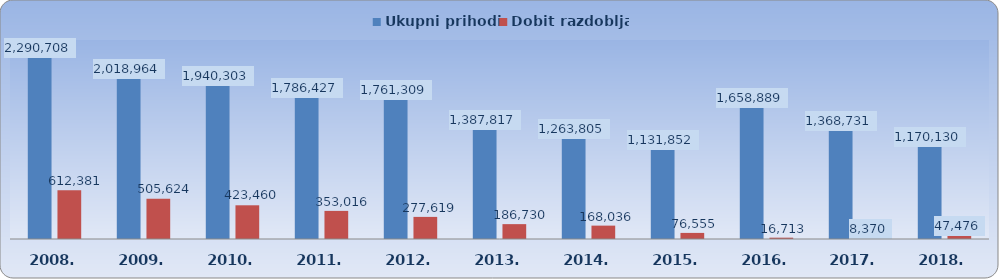
| Category | Ukupni prihodi | Dobit razdoblja |
|---|---|---|
| 2008.  | 2290708.434 | 612381.424 |
| 2009.  | 2018963.819 | 505624.269 |
| 2010.  | 1940303.308 | 423460.256 |
| 2011.  | 1786427.019 | 353016.469 |
| 2012.  | 1761308.677 | 277619.246 |
| 2013.  | 1387817.317 | 186729.641 |
| 2014.  | 1263804.577 | 168035.945 |
| 2015.  | 1131852.107 | 76555.198 |
| 2016.  | 1658888.864 | 16713.43 |
| 2017. | 1368731.237 | 8369.664 |
| 2018. | 1170130.2 | 47476.143 |